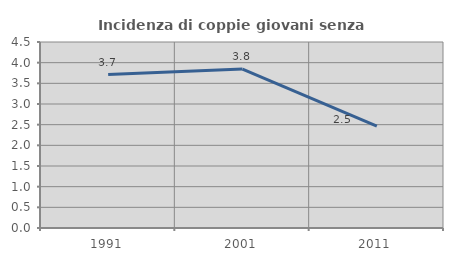
| Category | Incidenza di coppie giovani senza figli |
|---|---|
| 1991.0 | 3.712 |
| 2001.0 | 3.846 |
| 2011.0 | 2.466 |